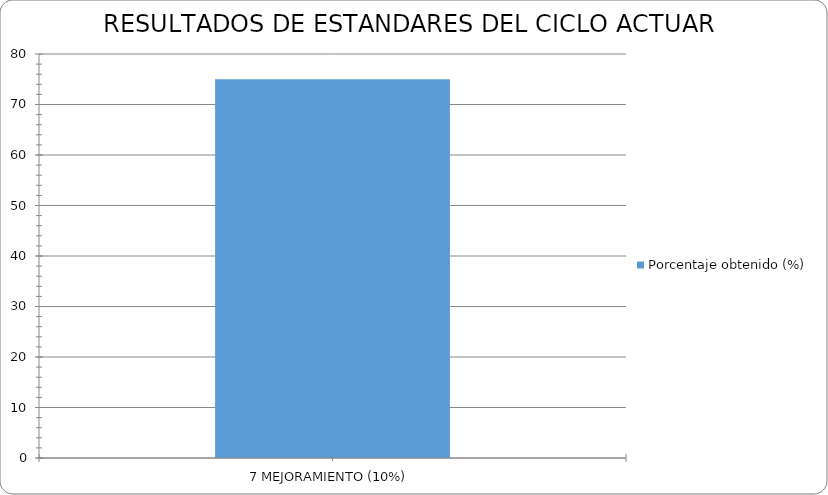
| Category | Porcentaje obtenido (%) |
|---|---|
| 7 MEJORAMIENTO (10%) | 75 |